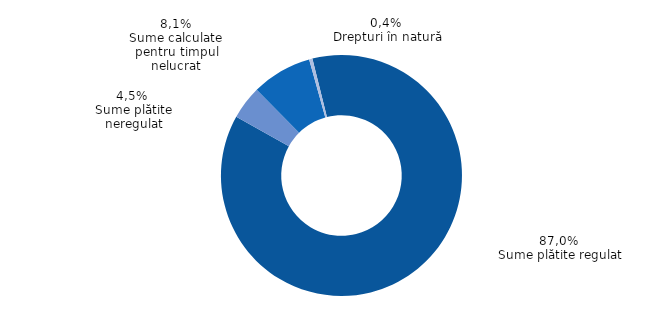
| Category | Series 0 |
|---|---|
| Sume plătite regulat | 86.984 |
| Sume plătite neregulat | 4.486 |
| Sume calculate pentru timpul nelucrat | 8.093 |
| Drepturi
în natură | 0.437 |